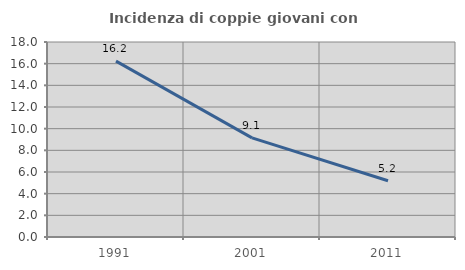
| Category | Incidenza di coppie giovani con figli |
|---|---|
| 1991.0 | 16.239 |
| 2001.0 | 9.149 |
| 2011.0 | 5.197 |